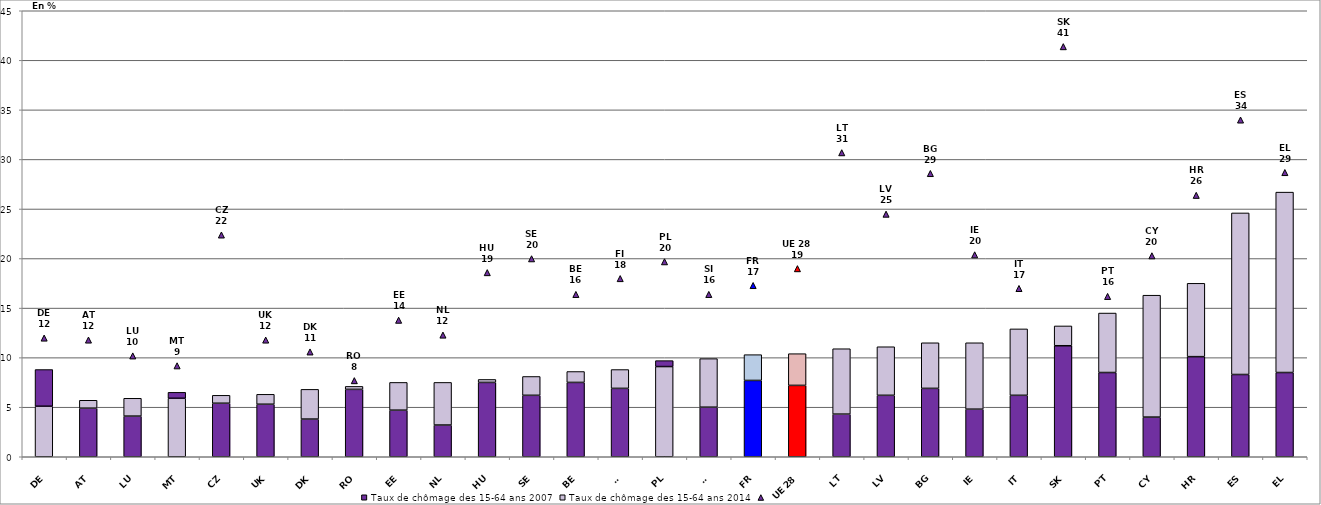
| Category | Taux de chômage des 15-64 ans 2007 | Taux de chômage des 15-64 ans 2014 |
|---|---|---|
| DE | 5.1 | 3.7 |
| AT | 4.9 | 0.8 |
| LU | 4.1 | 1.8 |
| MT | 5.9 | 0.6 |
| CZ | 5.4 | 0.8 |
| UK | 5.3 | 1 |
| DK | 3.8 | 3 |
| RO | 6.8 | 0.3 |
| EE | 4.7 | 2.8 |
| NL | 3.2 | 4.3 |
| HU | 7.5 | 0.3 |
| SE | 6.2 | 1.9 |
| BE | 7.5 | 1.1 |
| FI | 6.9 | 1.9 |
| PL | 9.1 | 0.6 |
| SI | 5 | 4.9 |
| FR | 7.7 | 2.6 |
| UE 28 | 7.2 | 3.2 |
| LT | 4.3 | 6.6 |
| LV | 6.2 | 4.9 |
| BG | 6.9 | 4.6 |
| IE | 4.8 | 6.7 |
| IT | 6.2 | 6.7 |
| SK | 11.2 | 2 |
| PT | 8.5 | 6 |
| CY | 4 | 12.3 |
| HR | 10.1 | 7.4 |
| ES | 8.3 | 16.3 |
| EL | 8.5 | 18.2 |